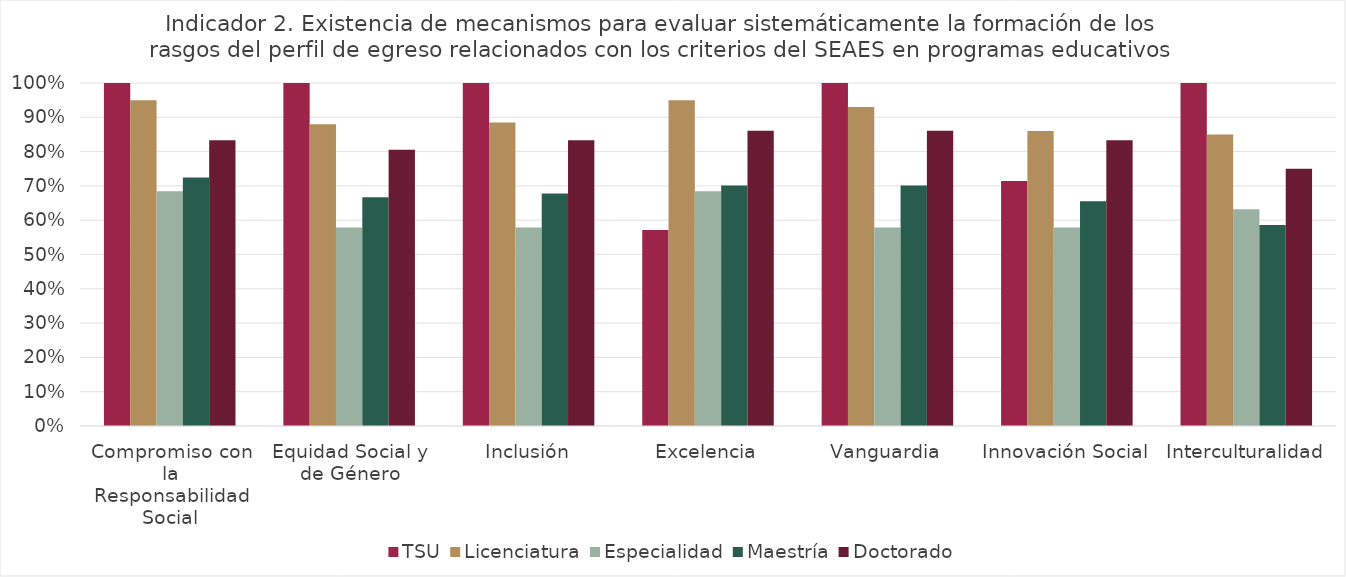
| Category | TSU | Licenciatura | Especialidad | Maestría | Doctorado |
|---|---|---|---|---|---|
| Compromiso con la Responsabilidad Social | 1 | 0.95 | 0.684 | 0.724 | 0.833 |
| Equidad Social y de Género | 1 | 0.88 | 0.579 | 0.667 | 0.806 |
| Inclusión | 1 | 0.885 | 0.579 | 0.678 | 0.833 |
| Excelencia | 0.571 | 0.95 | 0.684 | 0.701 | 0.861 |
| Vanguardia | 1 | 0.93 | 0.579 | 0.701 | 0.861 |
| Innovación Social | 0.714 | 0.86 | 0.579 | 0.655 | 0.833 |
| Interculturalidad | 1 | 0.85 | 0.632 | 0.586 | 0.75 |